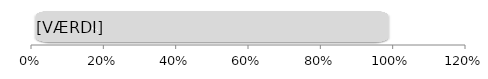
| Category | Series 1 | Udbetalt |
|---|---|---|
| 0 | 1 | 0 |